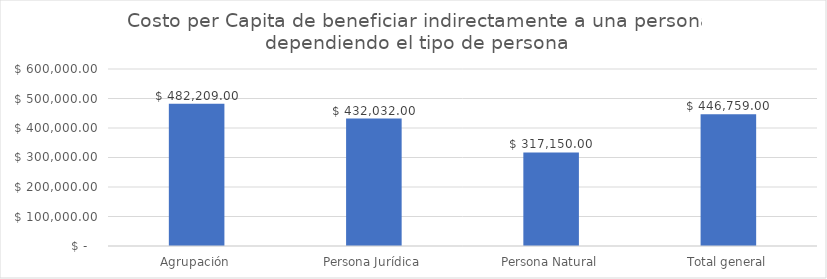
| Category | valor promedio |
|---|---|
| Agrupación | 482209 |
| Persona Jurídica | 432032 |
| Persona Natural | 317150 |
| Total general | 446759 |